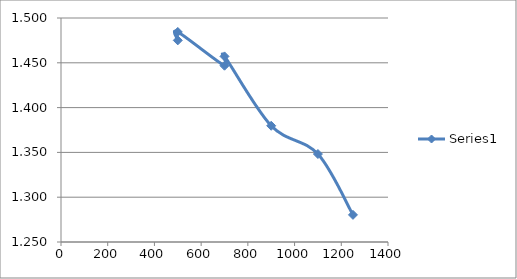
| Category | Series 0 |
|---|---|
| 500.0 | 1.475 |
| 500.0 | 1.484 |
| 700.0 | 1.447 |
| 700.0 | 1.457 |
| 900.0 | 1.38 |
| 1100.0 | 1.348 |
| 1250.0 | 1.28 |